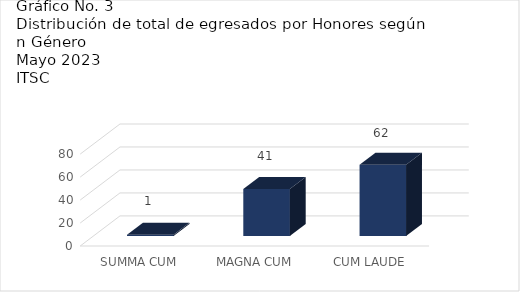
| Category | Series 0 |
|---|---|
| 0 | 1 |
| 1 | 41 |
| 2 | 62 |